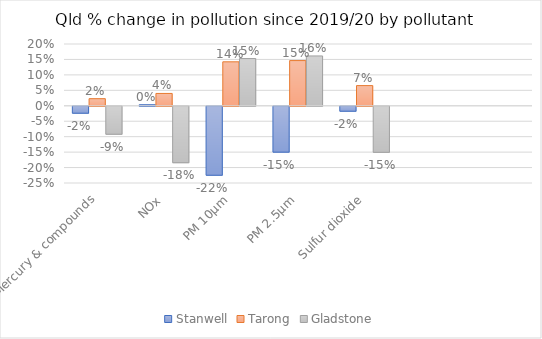
| Category | Stanwell | Tarong | Gladstone |
|---|---|---|---|
| Mercury & compounds | -0.023 | 0.023 | -0.091 |
| NOx | 0.003 | 0.04 | -0.183 |
| PM 10μm | -0.223 | 0.142 | 0.153 |
| PM 2.5μm | -0.149 | 0.146 | 0.161 |
| Sulfur dioxide | -0.016 | 0.065 | -0.149 |